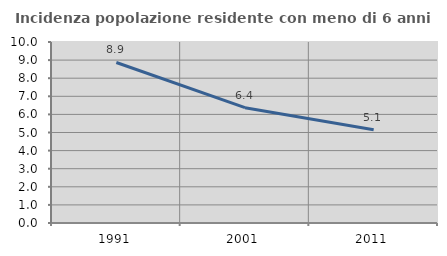
| Category | Incidenza popolazione residente con meno di 6 anni |
|---|---|
| 1991.0 | 8.868 |
| 2001.0 | 6.372 |
| 2011.0 | 5.147 |